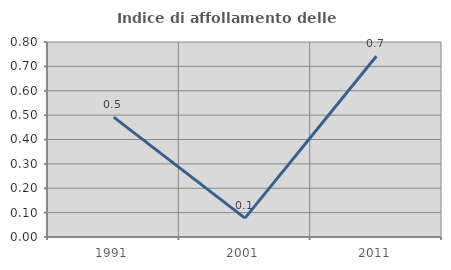
| Category | Indice di affollamento delle abitazioni  |
|---|---|
| 1991.0 | 0.492 |
| 2001.0 | 0.077 |
| 2011.0 | 0.741 |